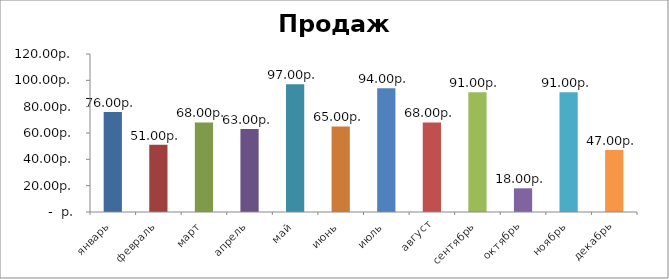
| Category | Продажи |
|---|---|
| январь | 76 |
| февраль | 51 |
| март | 68 |
| апрель | 63 |
| май | 97 |
| июнь | 65 |
| июль | 94 |
| август | 68 |
| сентябрь | 91 |
| октябрь | 18 |
| ноябрь | 91 |
| декабрь | 47 |